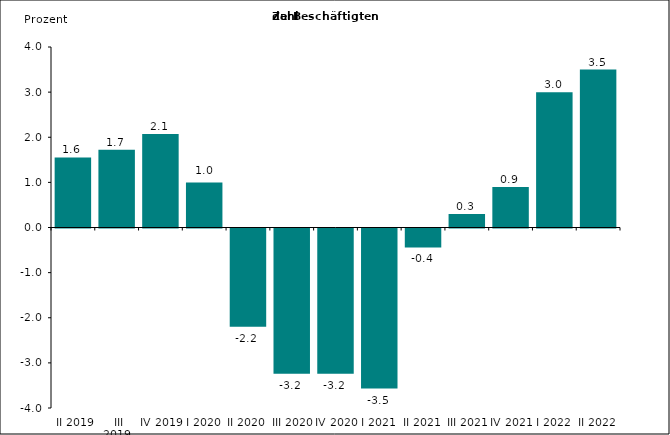
| Category | Series 0 |
|---|---|
|  II 2019 | 1.554 |
|  III 2019 | 1.726 |
| IV 2019 | 2.07 |
| I 2020 | 1 |
| II 2020 | -2.176 |
| III 2020 | -3.218 |
| IV 2020 | -3.22 |
| I 2021 | -3.546 |
| II 2021 | -0.419 |
| III 2021 | 0.3 |
| IV 2021 | 0.9 |
| I 2022 | 3 |
| II 2022 | 3.5 |